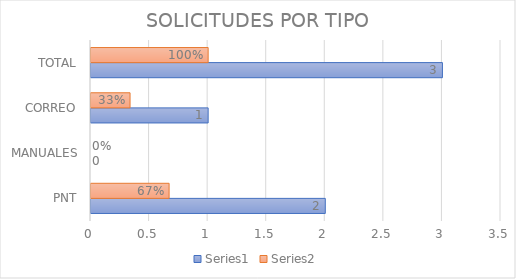
| Category | Series 0 | Series 1 |
|---|---|---|
| PNT | 2 | 0.667 |
| MANUALES | 0 | 0 |
| CORREO | 1 | 0.333 |
| TOTAL | 3 | 1 |